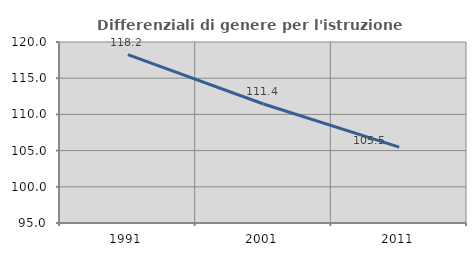
| Category | Differenziali di genere per l'istruzione superiore |
|---|---|
| 1991.0 | 118.247 |
| 2001.0 | 111.433 |
| 2011.0 | 105.475 |